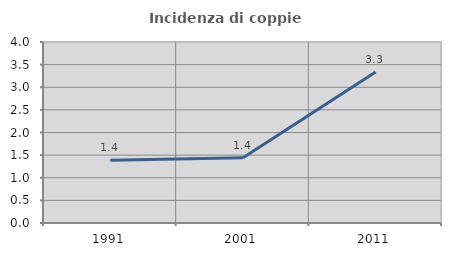
| Category | Incidenza di coppie miste |
|---|---|
| 1991.0 | 1.386 |
| 2001.0 | 1.442 |
| 2011.0 | 3.336 |